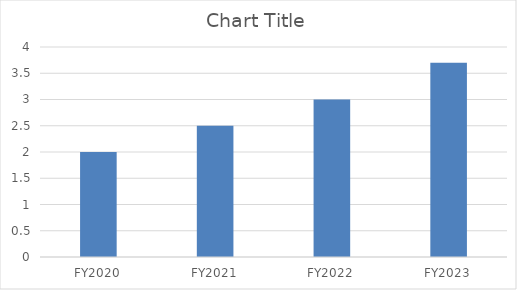
| Category | Series 0 |
|---|---|
| FY2020 | 2 |
| FY2021 | 2.5 |
| FY2022 | 3 |
| FY2023 | 3.7 |